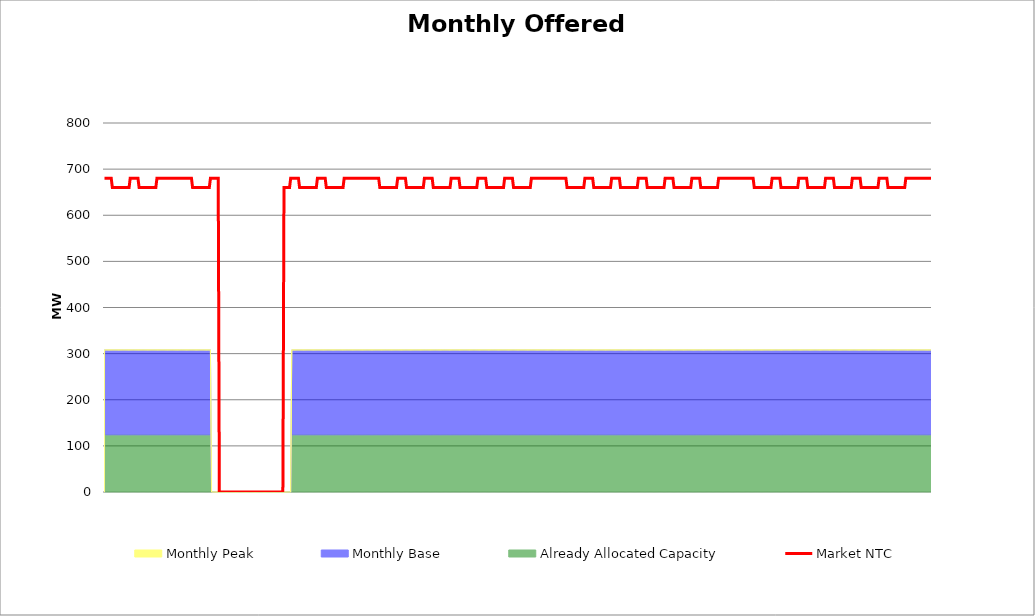
| Category | Market NTC |
|---|---|
| 0 | 680 |
| 1 | 680 |
| 2 | 680 |
| 3 | 680 |
| 4 | 680 |
| 5 | 680 |
| 6 | 680 |
| 7 | 660 |
| 8 | 660 |
| 9 | 660 |
| 10 | 660 |
| 11 | 660 |
| 12 | 660 |
| 13 | 660 |
| 14 | 660 |
| 15 | 660 |
| 16 | 660 |
| 17 | 660 |
| 18 | 660 |
| 19 | 660 |
| 20 | 660 |
| 21 | 660 |
| 22 | 660 |
| 23 | 680 |
| 24 | 680 |
| 25 | 680 |
| 26 | 680 |
| 27 | 680 |
| 28 | 680 |
| 29 | 680 |
| 30 | 680 |
| 31 | 660 |
| 32 | 660 |
| 33 | 660 |
| 34 | 660 |
| 35 | 660 |
| 36 | 660 |
| 37 | 660 |
| 38 | 660 |
| 39 | 660 |
| 40 | 660 |
| 41 | 660 |
| 42 | 660 |
| 43 | 660 |
| 44 | 660 |
| 45 | 660 |
| 46 | 660 |
| 47 | 680 |
| 48 | 680 |
| 49 | 680 |
| 50 | 680 |
| 51 | 680 |
| 52 | 680 |
| 53 | 680 |
| 54 | 680 |
| 55 | 680 |
| 56 | 680 |
| 57 | 680 |
| 58 | 680 |
| 59 | 680 |
| 60 | 680 |
| 61 | 680 |
| 62 | 680 |
| 63 | 680 |
| 64 | 680 |
| 65 | 680 |
| 66 | 680 |
| 67 | 680 |
| 68 | 680 |
| 69 | 680 |
| 70 | 680 |
| 71 | 680 |
| 72 | 680 |
| 73 | 680 |
| 74 | 680 |
| 75 | 680 |
| 76 | 680 |
| 77 | 680 |
| 78 | 680 |
| 79 | 660 |
| 80 | 660 |
| 81 | 660 |
| 82 | 660 |
| 83 | 660 |
| 84 | 660 |
| 85 | 660 |
| 86 | 660 |
| 87 | 660 |
| 88 | 660 |
| 89 | 660 |
| 90 | 660 |
| 91 | 660 |
| 92 | 660 |
| 93 | 660 |
| 94 | 660 |
| 95 | 680 |
| 96 | 680 |
| 97 | 680 |
| 98 | 680 |
| 99 | 680 |
| 100 | 680 |
| 101 | 680 |
| 102 | 680 |
| 103 | 0 |
| 104 | 0 |
| 105 | 0 |
| 106 | 0 |
| 107 | 0 |
| 108 | 0 |
| 109 | 0 |
| 110 | 0 |
| 111 | 0 |
| 112 | 0 |
| 113 | 0 |
| 114 | 0 |
| 115 | 0 |
| 116 | 0 |
| 117 | 0 |
| 118 | 0 |
| 119 | 0 |
| 120 | 0 |
| 121 | 0 |
| 122 | 0 |
| 123 | 0 |
| 124 | 0 |
| 125 | 0 |
| 126 | 0 |
| 127 | 0 |
| 128 | 0 |
| 129 | 0 |
| 130 | 0 |
| 131 | 0 |
| 132 | 0 |
| 133 | 0 |
| 134 | 0 |
| 135 | 0 |
| 136 | 0 |
| 137 | 0 |
| 138 | 0 |
| 139 | 0 |
| 140 | 0 |
| 141 | 0 |
| 142 | 0 |
| 143 | 0 |
| 144 | 0 |
| 145 | 0 |
| 146 | 0 |
| 147 | 0 |
| 148 | 0 |
| 149 | 0 |
| 150 | 0 |
| 151 | 0 |
| 152 | 0 |
| 153 | 0 |
| 154 | 0 |
| 155 | 0 |
| 156 | 0 |
| 157 | 0 |
| 158 | 0 |
| 159 | 0 |
| 160 | 0 |
| 161 | 660 |
| 162 | 660 |
| 163 | 660 |
| 164 | 660 |
| 165 | 660 |
| 166 | 660 |
| 167 | 680 |
| 168 | 680 |
| 169 | 680 |
| 170 | 680 |
| 171 | 680 |
| 172 | 680 |
| 173 | 680 |
| 174 | 680 |
| 175 | 660 |
| 176 | 660 |
| 177 | 660 |
| 178 | 660 |
| 179 | 660 |
| 180 | 660 |
| 181 | 660 |
| 182 | 660 |
| 183 | 660 |
| 184 | 660 |
| 185 | 660 |
| 186 | 660 |
| 187 | 660 |
| 188 | 660 |
| 189 | 660 |
| 190 | 660 |
| 191 | 680 |
| 192 | 680 |
| 193 | 680 |
| 194 | 680 |
| 195 | 680 |
| 196 | 680 |
| 197 | 680 |
| 198 | 680 |
| 199 | 660 |
| 200 | 660 |
| 201 | 660 |
| 202 | 660 |
| 203 | 660 |
| 204 | 660 |
| 205 | 660 |
| 206 | 660 |
| 207 | 660 |
| 208 | 660 |
| 209 | 660 |
| 210 | 660 |
| 211 | 660 |
| 212 | 660 |
| 213 | 660 |
| 214 | 660 |
| 215 | 680 |
| 216 | 680 |
| 217 | 680 |
| 218 | 680 |
| 219 | 680 |
| 220 | 680 |
| 221 | 680 |
| 222 | 680 |
| 223 | 680 |
| 224 | 680 |
| 225 | 680 |
| 226 | 680 |
| 227 | 680 |
| 228 | 680 |
| 229 | 680 |
| 230 | 680 |
| 231 | 680 |
| 232 | 680 |
| 233 | 680 |
| 234 | 680 |
| 235 | 680 |
| 236 | 680 |
| 237 | 680 |
| 238 | 680 |
| 239 | 680 |
| 240 | 680 |
| 241 | 680 |
| 242 | 680 |
| 243 | 680 |
| 244 | 680 |
| 245 | 680 |
| 246 | 680 |
| 247 | 660 |
| 248 | 660 |
| 249 | 660 |
| 250 | 660 |
| 251 | 660 |
| 252 | 660 |
| 253 | 660 |
| 254 | 660 |
| 255 | 660 |
| 256 | 660 |
| 257 | 660 |
| 258 | 660 |
| 259 | 660 |
| 260 | 660 |
| 261 | 660 |
| 262 | 660 |
| 263 | 680 |
| 264 | 680 |
| 265 | 680 |
| 266 | 680 |
| 267 | 680 |
| 268 | 680 |
| 269 | 680 |
| 270 | 680 |
| 271 | 660 |
| 272 | 660 |
| 273 | 660 |
| 274 | 660 |
| 275 | 660 |
| 276 | 660 |
| 277 | 660 |
| 278 | 660 |
| 279 | 660 |
| 280 | 660 |
| 281 | 660 |
| 282 | 660 |
| 283 | 660 |
| 284 | 660 |
| 285 | 660 |
| 286 | 660 |
| 287 | 680 |
| 288 | 680 |
| 289 | 680 |
| 290 | 680 |
| 291 | 680 |
| 292 | 680 |
| 293 | 680 |
| 294 | 680 |
| 295 | 660 |
| 296 | 660 |
| 297 | 660 |
| 298 | 660 |
| 299 | 660 |
| 300 | 660 |
| 301 | 660 |
| 302 | 660 |
| 303 | 660 |
| 304 | 660 |
| 305 | 660 |
| 306 | 660 |
| 307 | 660 |
| 308 | 660 |
| 309 | 660 |
| 310 | 660 |
| 311 | 680 |
| 312 | 680 |
| 313 | 680 |
| 314 | 680 |
| 315 | 680 |
| 316 | 680 |
| 317 | 680 |
| 318 | 680 |
| 319 | 660 |
| 320 | 660 |
| 321 | 660 |
| 322 | 660 |
| 323 | 660 |
| 324 | 660 |
| 325 | 660 |
| 326 | 660 |
| 327 | 660 |
| 328 | 660 |
| 329 | 660 |
| 330 | 660 |
| 331 | 660 |
| 332 | 660 |
| 333 | 660 |
| 334 | 660 |
| 335 | 680 |
| 336 | 680 |
| 337 | 680 |
| 338 | 680 |
| 339 | 680 |
| 340 | 680 |
| 341 | 680 |
| 342 | 680 |
| 343 | 660 |
| 344 | 660 |
| 345 | 660 |
| 346 | 660 |
| 347 | 660 |
| 348 | 660 |
| 349 | 660 |
| 350 | 660 |
| 351 | 660 |
| 352 | 660 |
| 353 | 660 |
| 354 | 660 |
| 355 | 660 |
| 356 | 660 |
| 357 | 660 |
| 358 | 660 |
| 359 | 680 |
| 360 | 680 |
| 361 | 680 |
| 362 | 680 |
| 363 | 680 |
| 364 | 680 |
| 365 | 680 |
| 366 | 680 |
| 367 | 660 |
| 368 | 660 |
| 369 | 660 |
| 370 | 660 |
| 371 | 660 |
| 372 | 660 |
| 373 | 660 |
| 374 | 660 |
| 375 | 660 |
| 376 | 660 |
| 377 | 660 |
| 378 | 660 |
| 379 | 660 |
| 380 | 660 |
| 381 | 660 |
| 382 | 660 |
| 383 | 680 |
| 384 | 680 |
| 385 | 680 |
| 386 | 680 |
| 387 | 680 |
| 388 | 680 |
| 389 | 680 |
| 390 | 680 |
| 391 | 680 |
| 392 | 680 |
| 393 | 680 |
| 394 | 680 |
| 395 | 680 |
| 396 | 680 |
| 397 | 680 |
| 398 | 680 |
| 399 | 680 |
| 400 | 680 |
| 401 | 680 |
| 402 | 680 |
| 403 | 680 |
| 404 | 680 |
| 405 | 680 |
| 406 | 680 |
| 407 | 680 |
| 408 | 680 |
| 409 | 680 |
| 410 | 680 |
| 411 | 680 |
| 412 | 680 |
| 413 | 680 |
| 414 | 680 |
| 415 | 660 |
| 416 | 660 |
| 417 | 660 |
| 418 | 660 |
| 419 | 660 |
| 420 | 660 |
| 421 | 660 |
| 422 | 660 |
| 423 | 660 |
| 424 | 660 |
| 425 | 660 |
| 426 | 660 |
| 427 | 660 |
| 428 | 660 |
| 429 | 660 |
| 430 | 660 |
| 431 | 680 |
| 432 | 680 |
| 433 | 680 |
| 434 | 680 |
| 435 | 680 |
| 436 | 680 |
| 437 | 680 |
| 438 | 680 |
| 439 | 660 |
| 440 | 660 |
| 441 | 660 |
| 442 | 660 |
| 443 | 660 |
| 444 | 660 |
| 445 | 660 |
| 446 | 660 |
| 447 | 660 |
| 448 | 660 |
| 449 | 660 |
| 450 | 660 |
| 451 | 660 |
| 452 | 660 |
| 453 | 660 |
| 454 | 660 |
| 455 | 680 |
| 456 | 680 |
| 457 | 680 |
| 458 | 680 |
| 459 | 680 |
| 460 | 680 |
| 461 | 680 |
| 462 | 680 |
| 463 | 660 |
| 464 | 660 |
| 465 | 660 |
| 466 | 660 |
| 467 | 660 |
| 468 | 660 |
| 469 | 660 |
| 470 | 660 |
| 471 | 660 |
| 472 | 660 |
| 473 | 660 |
| 474 | 660 |
| 475 | 660 |
| 476 | 660 |
| 477 | 660 |
| 478 | 660 |
| 479 | 680 |
| 480 | 680 |
| 481 | 680 |
| 482 | 680 |
| 483 | 680 |
| 484 | 680 |
| 485 | 680 |
| 486 | 680 |
| 487 | 660 |
| 488 | 660 |
| 489 | 660 |
| 490 | 660 |
| 491 | 660 |
| 492 | 660 |
| 493 | 660 |
| 494 | 660 |
| 495 | 660 |
| 496 | 660 |
| 497 | 660 |
| 498 | 660 |
| 499 | 660 |
| 500 | 660 |
| 501 | 660 |
| 502 | 660 |
| 503 | 680 |
| 504 | 680 |
| 505 | 680 |
| 506 | 680 |
| 507 | 680 |
| 508 | 680 |
| 509 | 680 |
| 510 | 680 |
| 511 | 660 |
| 512 | 660 |
| 513 | 660 |
| 514 | 660 |
| 515 | 660 |
| 516 | 660 |
| 517 | 660 |
| 518 | 660 |
| 519 | 660 |
| 520 | 660 |
| 521 | 660 |
| 522 | 660 |
| 523 | 660 |
| 524 | 660 |
| 525 | 660 |
| 526 | 660 |
| 527 | 680 |
| 528 | 680 |
| 529 | 680 |
| 530 | 680 |
| 531 | 680 |
| 532 | 680 |
| 533 | 680 |
| 534 | 680 |
| 535 | 660 |
| 536 | 660 |
| 537 | 660 |
| 538 | 660 |
| 539 | 660 |
| 540 | 660 |
| 541 | 660 |
| 542 | 660 |
| 543 | 660 |
| 544 | 660 |
| 545 | 660 |
| 546 | 660 |
| 547 | 660 |
| 548 | 660 |
| 549 | 660 |
| 550 | 660 |
| 551 | 680 |
| 552 | 680 |
| 553 | 680 |
| 554 | 680 |
| 555 | 680 |
| 556 | 680 |
| 557 | 680 |
| 558 | 680 |
| 559 | 680 |
| 560 | 680 |
| 561 | 680 |
| 562 | 680 |
| 563 | 680 |
| 564 | 680 |
| 565 | 680 |
| 566 | 680 |
| 567 | 680 |
| 568 | 680 |
| 569 | 680 |
| 570 | 680 |
| 571 | 680 |
| 572 | 680 |
| 573 | 680 |
| 574 | 680 |
| 575 | 680 |
| 576 | 680 |
| 577 | 680 |
| 578 | 680 |
| 579 | 680 |
| 580 | 680 |
| 581 | 680 |
| 582 | 680 |
| 583 | 660 |
| 584 | 660 |
| 585 | 660 |
| 586 | 660 |
| 587 | 660 |
| 588 | 660 |
| 589 | 660 |
| 590 | 660 |
| 591 | 660 |
| 592 | 660 |
| 593 | 660 |
| 594 | 660 |
| 595 | 660 |
| 596 | 660 |
| 597 | 660 |
| 598 | 660 |
| 599 | 680 |
| 600 | 680 |
| 601 | 680 |
| 602 | 680 |
| 603 | 680 |
| 604 | 680 |
| 605 | 680 |
| 606 | 680 |
| 607 | 660 |
| 608 | 660 |
| 609 | 660 |
| 610 | 660 |
| 611 | 660 |
| 612 | 660 |
| 613 | 660 |
| 614 | 660 |
| 615 | 660 |
| 616 | 660 |
| 617 | 660 |
| 618 | 660 |
| 619 | 660 |
| 620 | 660 |
| 621 | 660 |
| 622 | 660 |
| 623 | 680 |
| 624 | 680 |
| 625 | 680 |
| 626 | 680 |
| 627 | 680 |
| 628 | 680 |
| 629 | 680 |
| 630 | 680 |
| 631 | 660 |
| 632 | 660 |
| 633 | 660 |
| 634 | 660 |
| 635 | 660 |
| 636 | 660 |
| 637 | 660 |
| 638 | 660 |
| 639 | 660 |
| 640 | 660 |
| 641 | 660 |
| 642 | 660 |
| 643 | 660 |
| 644 | 660 |
| 645 | 660 |
| 646 | 660 |
| 647 | 680 |
| 648 | 680 |
| 649 | 680 |
| 650 | 680 |
| 651 | 680 |
| 652 | 680 |
| 653 | 680 |
| 654 | 680 |
| 655 | 660 |
| 656 | 660 |
| 657 | 660 |
| 658 | 660 |
| 659 | 660 |
| 660 | 660 |
| 661 | 660 |
| 662 | 660 |
| 663 | 660 |
| 664 | 660 |
| 665 | 660 |
| 666 | 660 |
| 667 | 660 |
| 668 | 660 |
| 669 | 660 |
| 670 | 660 |
| 671 | 680 |
| 672 | 680 |
| 673 | 680 |
| 674 | 680 |
| 675 | 680 |
| 676 | 680 |
| 677 | 680 |
| 678 | 680 |
| 679 | 660 |
| 680 | 660 |
| 681 | 660 |
| 682 | 660 |
| 683 | 660 |
| 684 | 660 |
| 685 | 660 |
| 686 | 660 |
| 687 | 660 |
| 688 | 660 |
| 689 | 660 |
| 690 | 660 |
| 691 | 660 |
| 692 | 660 |
| 693 | 660 |
| 694 | 660 |
| 695 | 680 |
| 696 | 680 |
| 697 | 680 |
| 698 | 680 |
| 699 | 680 |
| 700 | 680 |
| 701 | 680 |
| 702 | 680 |
| 703 | 660 |
| 704 | 660 |
| 705 | 660 |
| 706 | 660 |
| 707 | 660 |
| 708 | 660 |
| 709 | 660 |
| 710 | 660 |
| 711 | 660 |
| 712 | 660 |
| 713 | 660 |
| 714 | 660 |
| 715 | 660 |
| 716 | 660 |
| 717 | 660 |
| 718 | 660 |
| 719 | 680 |
| 720 | 680 |
| 721 | 680 |
| 722 | 680 |
| 723 | 680 |
| 724 | 680 |
| 725 | 680 |
| 726 | 680 |
| 727 | 680 |
| 728 | 680 |
| 729 | 680 |
| 730 | 680 |
| 731 | 680 |
| 732 | 680 |
| 733 | 680 |
| 734 | 680 |
| 735 | 680 |
| 736 | 680 |
| 737 | 680 |
| 738 | 680 |
| 739 | 680 |
| 740 | 680 |
| 741 | 680 |
| 742 | 680 |